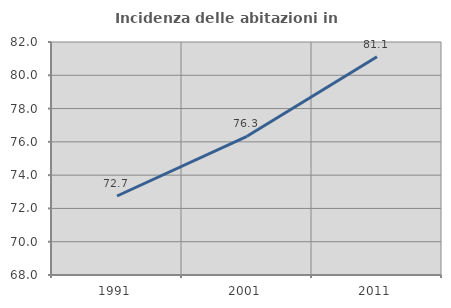
| Category | Incidenza delle abitazioni in proprietà  |
|---|---|
| 1991.0 | 72.747 |
| 2001.0 | 76.335 |
| 2011.0 | 81.114 |